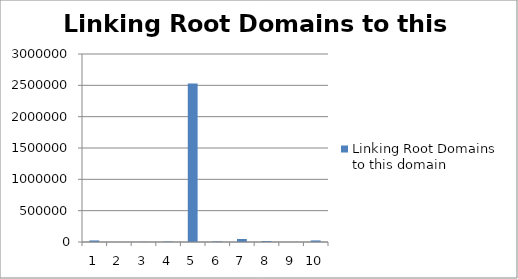
| Category | Linking Root Domains to this domain |
|---|---|
| 0 | 24944 |
| 1 | 90 |
| 2 | 2765 |
| 3 | 6853 |
| 4 | 2530965 |
| 5 | 9665 |
| 6 | 47985 |
| 7 | 15605 |
| 8 | 124 |
| 9 | 24944 |